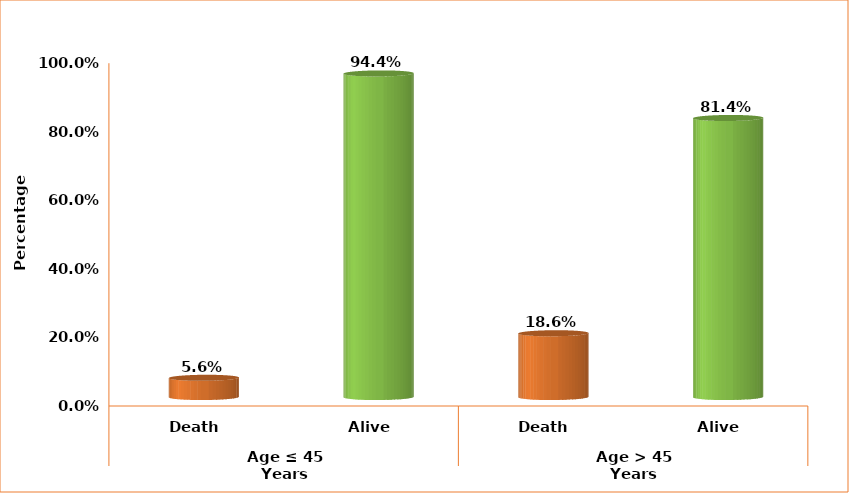
| Category | Series 0 |
|---|---|
| 0 | 0.056 |
| 1 | 0.944 |
| 2 | 0.186 |
| 3 | 0.814 |